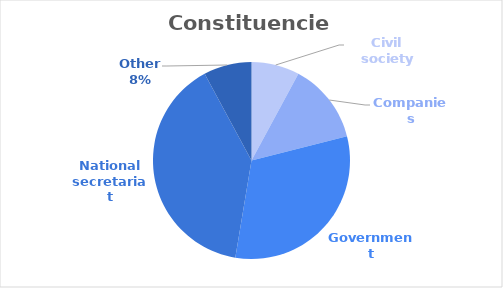
| Category | Series 0 |
|---|---|
| Civil society | 3 |
| Companies | 5 |
| Government | 12 |
| National secretariat | 15 |
| Other | 3 |